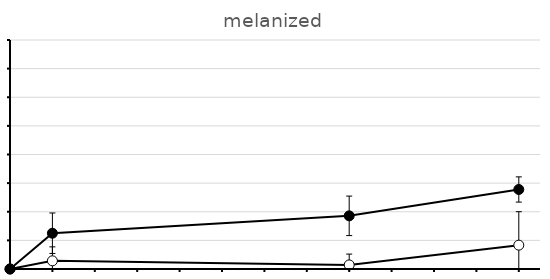
| Category | Series 0 | Series 1 |
|---|---|---|
| 0.0 | 0 | 0 |
| 2.0 | 0.286 | 1.25 |
| 16.0 | 0.143 | 1.857 |
| 24.0 | 0.833 | 2.778 |